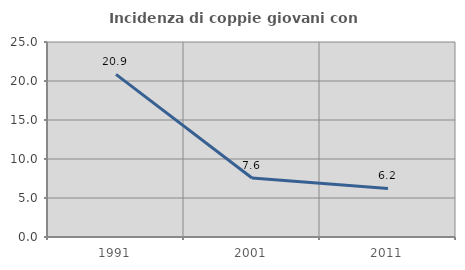
| Category | Incidenza di coppie giovani con figli |
|---|---|
| 1991.0 | 20.855 |
| 2001.0 | 7.572 |
| 2011.0 | 6.232 |